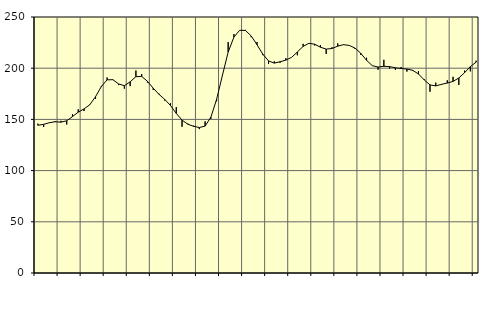
| Category | Piggar | Series 1 |
|---|---|---|
| nan | 145.8 | 144.28 |
| 1.0 | 142.6 | 145.16 |
| 1.0 | 147 | 146.76 |
| 1.0 | 148.4 | 147.7 |
| nan | 148.6 | 147.31 |
| 2.0 | 145 | 148.63 |
| 2.0 | 155 | 152.76 |
| 2.0 | 159.8 | 157.08 |
| nan | 158.2 | 160.23 |
| 3.0 | 164 | 164.3 |
| 3.0 | 170.1 | 172.21 |
| 3.0 | 182.7 | 182.03 |
| nan | 190.9 | 188.63 |
| 4.0 | 188.5 | 188.77 |
| 4.0 | 183.5 | 184.65 |
| 4.0 | 180 | 182.91 |
| nan | 182.5 | 186.7 |
| 5.0 | 197.7 | 191.7 |
| 5.0 | 194.3 | 192.01 |
| 5.0 | 186 | 187.19 |
| nan | 178.8 | 180.48 |
| 6.0 | 175.1 | 174.49 |
| 6.0 | 168.4 | 169.53 |
| 6.0 | 165.8 | 163.57 |
| nan | 162 | 155.88 |
| 7.0 | 142.8 | 149.31 |
| 7.0 | 145.9 | 145.3 |
| 7.0 | 143.9 | 143.25 |
| nan | 140.5 | 142.07 |
| 8.0 | 148.1 | 143.46 |
| 8.0 | 150.5 | 152.13 |
| 8.0 | 167.7 | 169.71 |
| nan | 193.3 | 192.89 |
| 9.0 | 225.5 | 215.78 |
| 9.0 | 233.3 | 230.41 |
| 9.0 | 237.1 | 237.07 |
| nan | 237.4 | 236.83 |
| 10.0 | 230.3 | 231.48 |
| 10.0 | 225.6 | 222.92 |
| 10.0 | 212.8 | 213.74 |
| nan | 204.2 | 207.13 |
| 11.0 | 206.7 | 204.96 |
| 11.0 | 205.3 | 206.28 |
| 11.0 | 209.8 | 207.9 |
| nan | 210.6 | 210.58 |
| 12.0 | 212.6 | 215.86 |
| 12.0 | 223.8 | 221.29 |
| 12.0 | 224.4 | 224.31 |
| nan | 222.2 | 223.43 |
| 13.0 | 222.6 | 220.5 |
| 13.0 | 213.9 | 218.65 |
| 13.0 | 220.4 | 219.21 |
| nan | 224.2 | 221.52 |
| 14.0 | 223.3 | 222.99 |
| 14.0 | 222.1 | 222.24 |
| 14.0 | 218.9 | 219.66 |
| nan | 213 | 214.52 |
| 15.0 | 210.2 | 207.7 |
| 15.0 | 202.6 | 202.46 |
| 15.0 | 198.5 | 201.13 |
| nan | 208.2 | 201.88 |
| 16.0 | 199.6 | 201.54 |
| 16.0 | 198.3 | 200.41 |
| 16.0 | 201.2 | 199.68 |
| nan | 196.7 | 199.16 |
| 17.0 | 197.5 | 197.94 |
| 17.0 | 197.1 | 194.37 |
| 17.0 | 189.2 | 188.53 |
| nan | 177 | 183.7 |
| 18.0 | 185.9 | 182.71 |
| 18.0 | 183.9 | 184.24 |
| 18.0 | 188.2 | 185.51 |
| nan | 191.6 | 187.11 |
| 19.0 | 183.6 | 190.46 |
| 19.0 | 197.6 | 195.63 |
| 19.0 | 196.9 | 201.54 |
| nan | 207.3 | 205.93 |